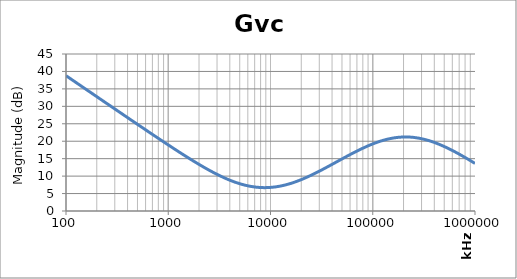
| Category | Gvc Gain |
|---|---|
| 100.0 | 38.786 |
| 125.89254117941677 | 36.787 |
| 158.48931924611153 | 34.788 |
| 199.52623149688802 | 32.79 |
| 251.18864315095806 | 30.794 |
| 316.22776601683825 | 28.8 |
| 398.1071705534976 | 26.809 |
| 501.1872336272727 | 24.823 |
| 630.9573444801932 | 22.846 |
| 794.3282347242821 | 20.881 |
| 1000.0 | 18.938 |
| 1258.925411794168 | 17.025 |
| 1584.8931924611156 | 15.162 |
| 1995.2623149688804 | 13.373 |
| 2511.886431509581 | 11.692 |
| 3162.2776601683804 | 10.166 |
| 3981.071705534977 | 8.851 |
| 5011.872336272732 | 7.806 |
| 6309.573444801938 | 7.086 |
| 7943.282347242815 | 6.73 |
| 10000.0 | 6.756 |
| 12589.254117941671 | 7.162 |
| 15848.931924611146 | 7.919 |
| 19952.623149688792 | 8.981 |
| 25118.86431509586 | 10.284 |
| 31622.77660168384 | 11.757 |
| 39810.71705534974 | 13.33 |
| 50118.723362727294 | 14.934 |
| 63095.73444801934 | 16.5 |
| 79432.82347242824 | 17.958 |
| 100000.0 | 19.232 |
| 125892.54117941685 | 20.245 |
| 158489.31924611164 | 20.925 |
| 199526.23149688813 | 21.218 |
| 251188.64315095844 | 21.098 |
| 316227.7660168382 | 20.571 |
| 398107.17055349716 | 19.676 |
| 501187.23362727347 | 18.471 |
| 630957.3444801942 | 17.022 |
| 794328.2347242833 | 15.394 |
| 1000000.0 | 13.639 |